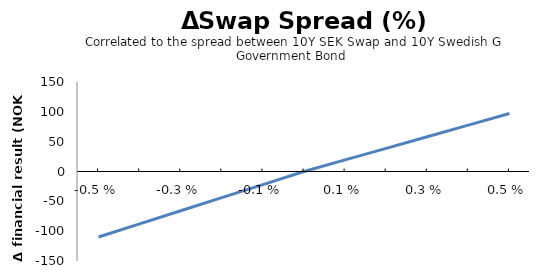
| Category | Series 0 |
|---|---|
| -0.005 | -109.735 |
| -0.004 | -87.788 |
| -0.003 | -65.841 |
| -0.002 | -43.894 |
| -0.001 | -21.947 |
| 0.0 | 0 |
| 0.001 | 19.422 |
| 0.002 | 38.845 |
| 0.003 | 58.267 |
| 0.004 | 77.69 |
| 0.005 | 97.112 |